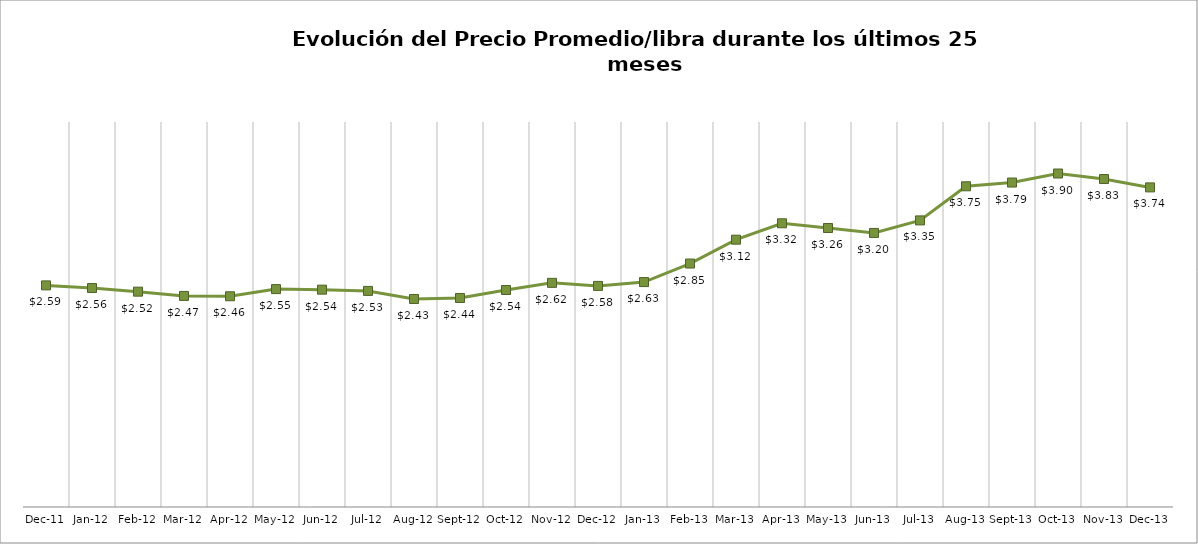
| Category | Series 1 |
|---|---|
| 2011-12-01 | 2.59 |
| 2012-01-01 | 2.559 |
| 2012-02-01 | 2.517 |
| 2012-03-01 | 2.467 |
| 2012-04-01 | 2.463 |
| 2012-05-01 | 2.547 |
| 2012-06-01 | 2.54 |
| 2012-07-01 | 2.526 |
| 2012-08-01 | 2.431 |
| 2012-09-01 | 2.443 |
| 2012-10-01 | 2.536 |
| 2012-11-01 | 2.62 |
| 2012-12-01 | 2.584 |
| 2013-01-01 | 2.629 |
| 2013-02-01 | 2.846 |
| 2013-03-01 | 3.124 |
| 2013-04-01 | 3.316 |
| 2013-05-01 | 3.261 |
| 2013-06-01 | 3.203 |
| 2013-07-01 | 3.35 |
| 2013-08-01 | 3.749 |
| 2013-09-01 | 3.792 |
| 2013-10-01 | 3.898 |
| 2013-11-01 | 3.833 |
| 2013-12-01 | 3.736 |